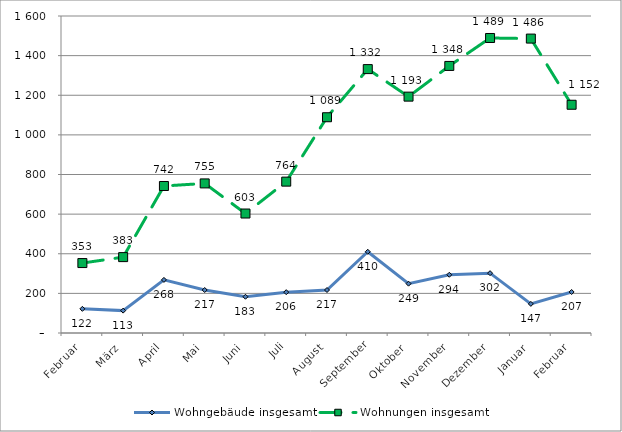
| Category | Wohngebäude insgesamt | Wohnungen insgesamt |
|---|---|---|
| Februar | 122 | 353 |
| März | 113 | 383 |
| April | 268 | 742 |
| Mai | 217 | 755 |
| Juni | 183 | 603 |
| Juli | 206 | 764 |
| August | 217 | 1089 |
| September | 410 | 1332 |
| Oktober | 249 | 1193 |
| November | 294 | 1348 |
| Dezember | 302 | 1489 |
| Januar | 147 | 1486 |
| Februar | 207 | 1152 |